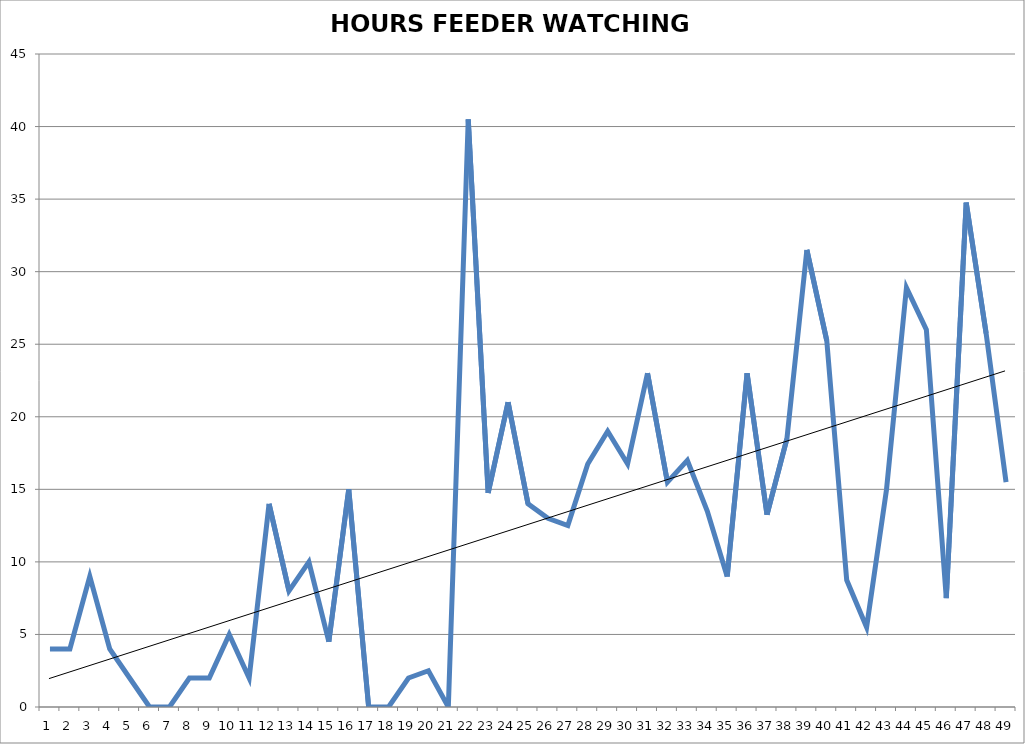
| Category | HOURS FEEDER WATCHING 1974-2022 |
|---|---|
| 0 | 4 |
| 1 | 4 |
| 2 | 9 |
| 3 | 4 |
| 4 | 2 |
| 5 | 0 |
| 6 | 0 |
| 7 | 2 |
| 8 | 2 |
| 9 | 5 |
| 10 | 2 |
| 11 | 14 |
| 12 | 8 |
| 13 | 10 |
| 14 | 4.5 |
| 15 | 15 |
| 16 | 0 |
| 17 | 0 |
| 18 | 2 |
| 19 | 2.5 |
| 20 | 0 |
| 21 | 40.5 |
| 22 | 14.75 |
| 23 | 21 |
| 24 | 14 |
| 25 | 13 |
| 26 | 12.5 |
| 27 | 16.75 |
| 28 | 19 |
| 29 | 16.75 |
| 30 | 23 |
| 31 | 15.5 |
| 32 | 17 |
| 33 | 13.5 |
| 34 | 9 |
| 35 | 23 |
| 36 | 13.25 |
| 37 | 18.5 |
| 38 | 31.5 |
| 39 | 25.25 |
| 40 | 8.75 |
| 41 | 5.5 |
| 42 | 15 |
| 43 | 28.9 |
| 44 | 26 |
| 45 | 7.5 |
| 46 | 34.75 |
| 47 | 25.75 |
| 48 | 15.5 |